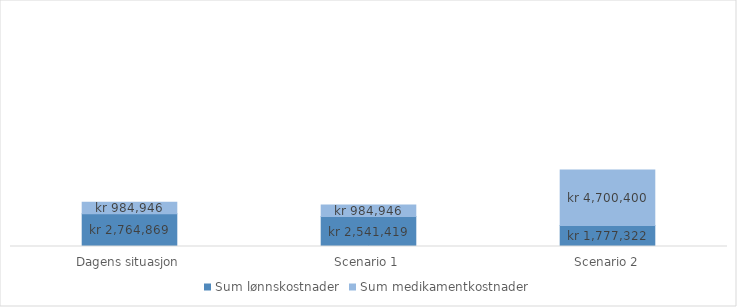
| Category | Sum lønnskostnader | Sum medikamentkostnader |
|---|---|---|
| Dagens situasjon | 2764869.449 | 984946.233 |
| Scenario 1 | 2541418.635 | 984946.233 |
| Scenario 2 | 1777321.875 | 4700400 |